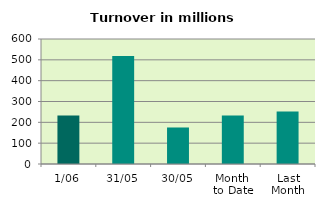
| Category | Series 0 |
|---|---|
| 1/06 | 233.274 |
| 31/05 | 518.831 |
| 30/05 | 175.275 |
| Month 
to Date | 233.274 |
| Last
Month | 251.573 |